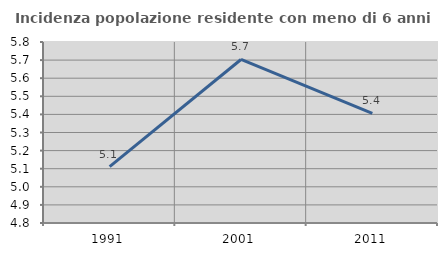
| Category | Incidenza popolazione residente con meno di 6 anni |
|---|---|
| 1991.0 | 5.111 |
| 2001.0 | 5.703 |
| 2011.0 | 5.405 |